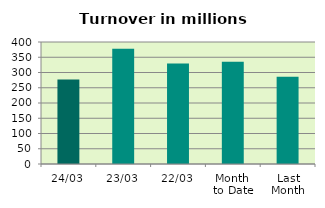
| Category | Series 0 |
|---|---|
| 24/03 | 277.282 |
| 23/03 | 377.628 |
| 22/03 | 329.153 |
| Month 
to Date | 335.51 |
| Last
Month | 285.972 |